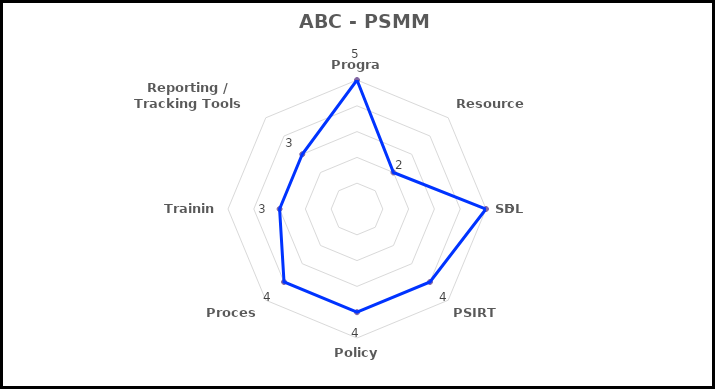
| Category | Series 3 |
|---|---|
| Program | 5 |
| Resources | 2 |
| SDL | 5 |
| PSIRT | 4 |
| Policy | 4 |
| Process | 4 |
| Training | 3 |
| Reporting / Tracking Tools | 3 |